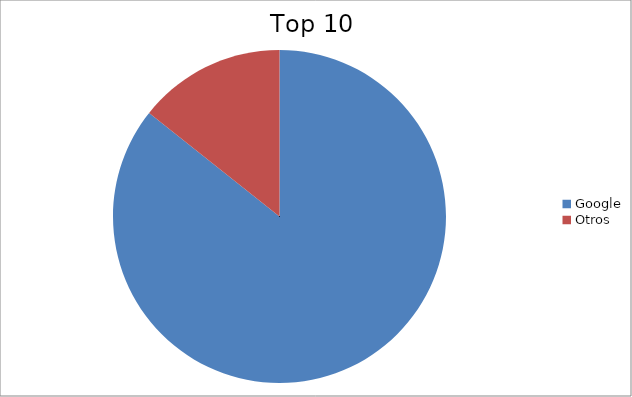
| Category | Series 0 |
|---|---|
| Google | 85.68 |
| Otros | 14.32 |